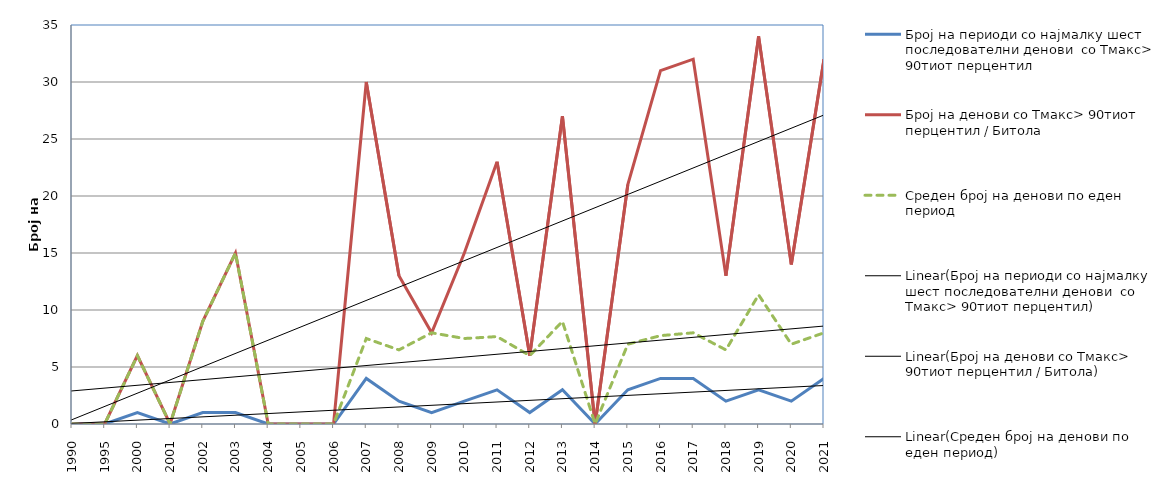
| Category | Број на периоди со најмалку шест последователни денови  со Тмакс> 90тиот перцентил | Број на денови со Тмакс> 90тиот перцентил / Битола | Среден број на денови по еден период |
|---|---|---|---|
| 1990.0 | 0 | 0 | 0 |
| 1995.0 | 0 | 0 | 0 |
| 2000.0 | 1 | 6 | 6 |
| 2001.0 | 0 | 0 | 0 |
| 2002.0 | 1 | 9 | 9 |
| 2003.0 | 1 | 15 | 15 |
| 2004.0 | 0 | 0 | 0 |
| 2005.0 | 0 | 0 | 0 |
| 2006.0 | 0 | 0 | 0 |
| 2007.0 | 4 | 30 | 7.5 |
| 2008.0 | 2 | 13 | 6.5 |
| 2009.0 | 1 | 8 | 8 |
| 2010.0 | 2 | 15 | 7.5 |
| 2011.0 | 3 | 23 | 7.667 |
| 2012.0 | 1 | 6 | 6 |
| 2013.0 | 3 | 27 | 9 |
| 2014.0 | 0 | 0 | 0 |
| 2015.0 | 3 | 21 | 7 |
| 2016.0 | 4 | 31 | 7.75 |
| 2017.0 | 4 | 32 | 8 |
| 2018.0 | 2 | 13 | 6.5 |
| 2019.0 | 3 | 34 | 11.333 |
| 2020.0 | 2 | 14 | 7 |
| 2021.0 | 4 | 32 | 8 |